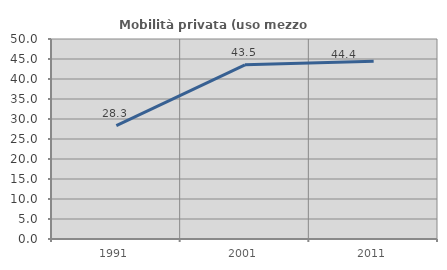
| Category | Mobilità privata (uso mezzo privato) |
|---|---|
| 1991.0 | 28.333 |
| 2001.0 | 43.548 |
| 2011.0 | 44.444 |